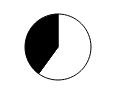
| Category | Series 0 |
|---|---|
| 0 | 0.6 |
| 1 | 0.4 |